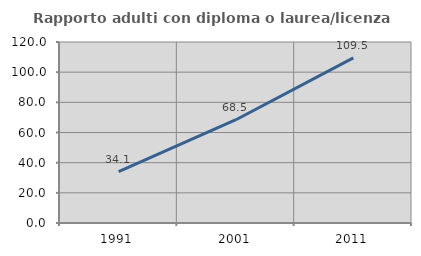
| Category | Rapporto adulti con diploma o laurea/licenza media  |
|---|---|
| 1991.0 | 34.118 |
| 2001.0 | 68.465 |
| 2011.0 | 109.494 |